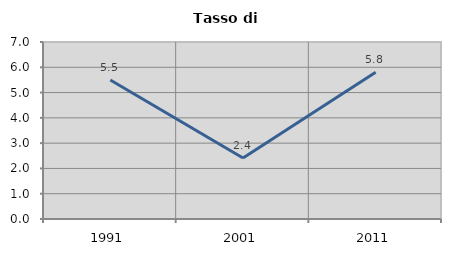
| Category | Tasso di disoccupazione   |
|---|---|
| 1991.0 | 5.494 |
| 2001.0 | 2.412 |
| 2011.0 | 5.808 |